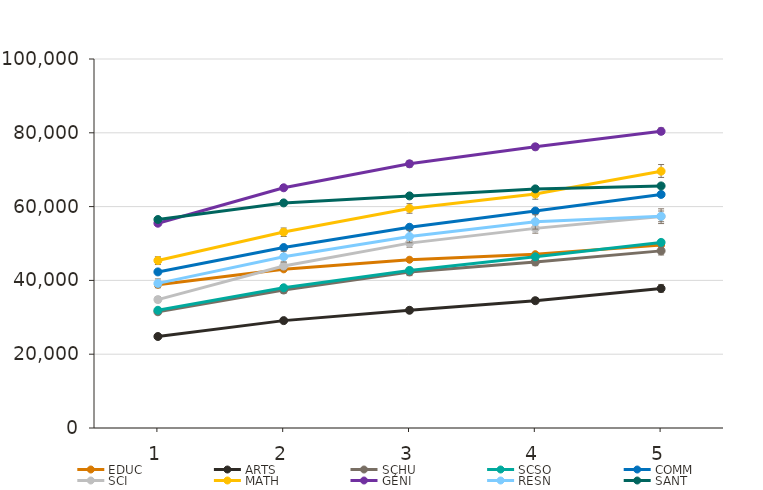
| Category | EDUC | ARTS | SCHU | SCSO | COMM | SCI | MATH | GÉNI | RESN | SANT |
|---|---|---|---|---|---|---|---|---|---|---|
| 1.0 | 38800 | 24800 | 31500 | 31900 | 42300 | 34800 | 45400 | 55500 | 39200 | 56500 |
| 2.0 | 43000 | 29100 | 37400 | 38000 | 48900 | 43900 | 53100 | 65100 | 46400 | 61000 |
| 3.0 | 45600 | 31900 | 42300 | 42700 | 54400 | 50100 | 59500 | 71600 | 51900 | 62900 |
| 4.0 | 47100 | 34500 | 45000 | 46400 | 58800 | 54100 | 63400 | 76200 | 55900 | 64800 |
| 5.0 | 49600 | 37800 | 48000 | 50300 | 63300 | 57300 | 69600 | 80400 | 57400 | 65600 |